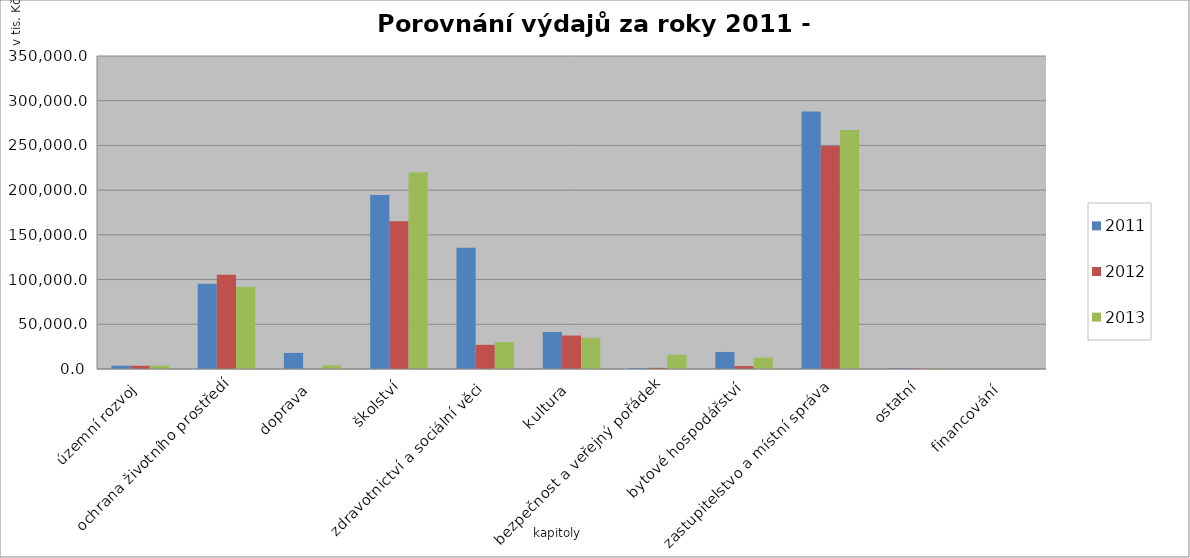
| Category | 2011 | 2012 | 2013 |
|---|---|---|---|
| územní rozvoj | 3755 | 3623.4 | 3780.4 |
| ochrana životního prostředí | 95226.3 | 105378.6 | 92090.4 |
| doprava | 17974.4 | 5.2 | 3939.6 |
| školství | 194469.3 | 165177.9 | 219956.2 |
| zdravotnictví a sociální věci | 135457.9 | 27049.3 | 30049.4 |
| kultura | 41403.4 | 37421.8 | 34967 |
| bezpečnost a veřejný pořádek | 1149.5 | 1275.3 | 15994.3 |
| bytové hospodářství | 19079.5 | 3297.7 | 12716.2 |
| zastupitelstvo a místní správa | 287889.7 | 249240.7 | 267237.2 |
| ostatní | 871.7 | 486.5 | 613.4 |
| financování | 0 | 0 | 0 |